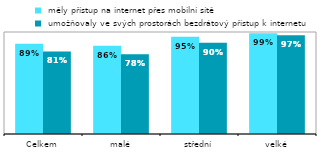
| Category |  měly přístup na internet přes mobilní sítě |  umožňovaly ve svých prostorách bezdrátový přístup k internetu |
|---|---|---|
| Celkem | 0.885 | 0.81 |
| malé | 0.864 | 0.783 |
| střední | 0.954 | 0.895 |
| velké | 0.988 | 0.967 |